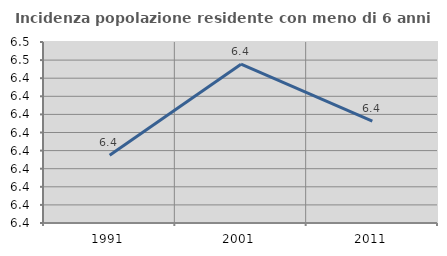
| Category | Incidenza popolazione residente con meno di 6 anni |
|---|---|
| 1991.0 | 6.397 |
| 2001.0 | 6.448 |
| 2011.0 | 6.416 |